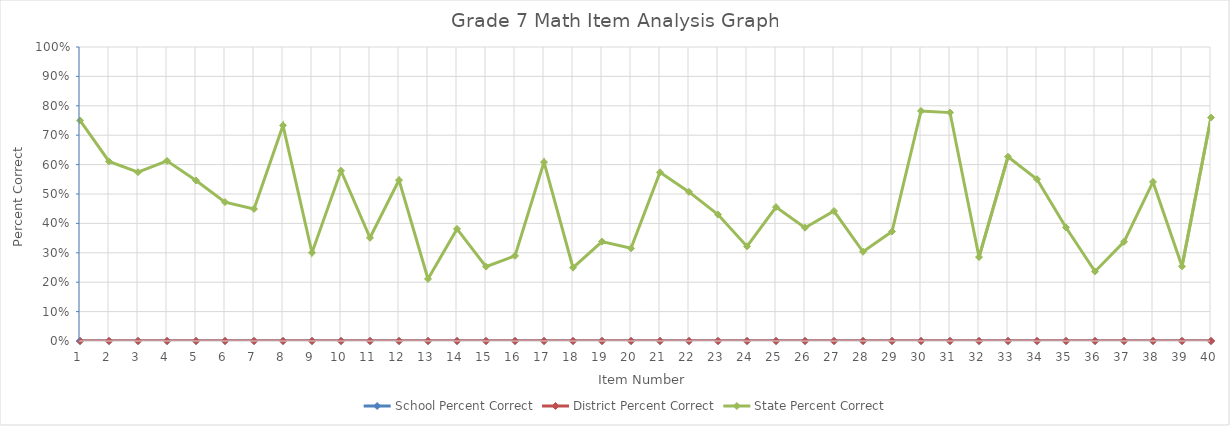
| Category | School Percent Correct | District Percent Correct | State Percent Correct |
|---|---|---|---|
| 1.0 | 0 | 0 | 0.75 |
| 2.0 | 0 | 0 | 0.611 |
| 3.0 | 0 | 0 | 0.574 |
| 4.0 | 0 | 0 | 0.613 |
| 5.0 | 0 | 0 | 0.546 |
| 6.0 | 0 | 0 | 0.472 |
| 7.0 | 0 | 0 | 0.449 |
| 8.0 | 0 | 0 | 0.733 |
| 9.0 | 0 | 0 | 0.3 |
| 10.0 | 0 | 0 | 0.579 |
| 11.0 | 0 | 0 | 0.351 |
| 12.0 | 0 | 0 | 0.547 |
| 13.0 | 0 | 0 | 0.211 |
| 14.0 | 0 | 0 | 0.381 |
| 15.0 | 0 | 0 | 0.253 |
| 16.0 | 0 | 0 | 0.29 |
| 17.0 | 0 | 0 | 0.609 |
| 18.0 | 0 | 0 | 0.249 |
| 19.0 | 0 | 0 | 0.338 |
| 20.0 | 0 | 0 | 0.315 |
| 21.0 | 0 | 0 | 0.574 |
| 22.0 | 0 | 0 | 0.507 |
| 23.0 | 0 | 0 | 0.43 |
| 24.0 | 0 | 0 | 0.322 |
| 25.0 | 0 | 0 | 0.456 |
| 26.0 | 0 | 0 | 0.385 |
| 27.0 | 0 | 0 | 0.442 |
| 28.0 | 0 | 0 | 0.304 |
| 29.0 | 0 | 0 | 0.372 |
| 30.0 | 0 | 0 | 0.782 |
| 31.0 | 0 | 0 | 0.777 |
| 32.0 | 0 | 0 | 0.285 |
| 33.0 | 0 | 0 | 0.627 |
| 34.0 | 0 | 0 | 0.55 |
| 35.0 | 0 | 0 | 0.386 |
| 36.0 | 0 | 0 | 0.237 |
| 37.0 | 0 | 0 | 0.337 |
| 38.0 | 0 | 0 | 0.541 |
| 39.0 | 0 | 0 | 0.254 |
| 40.0 | 0 | 0 | 0.76 |